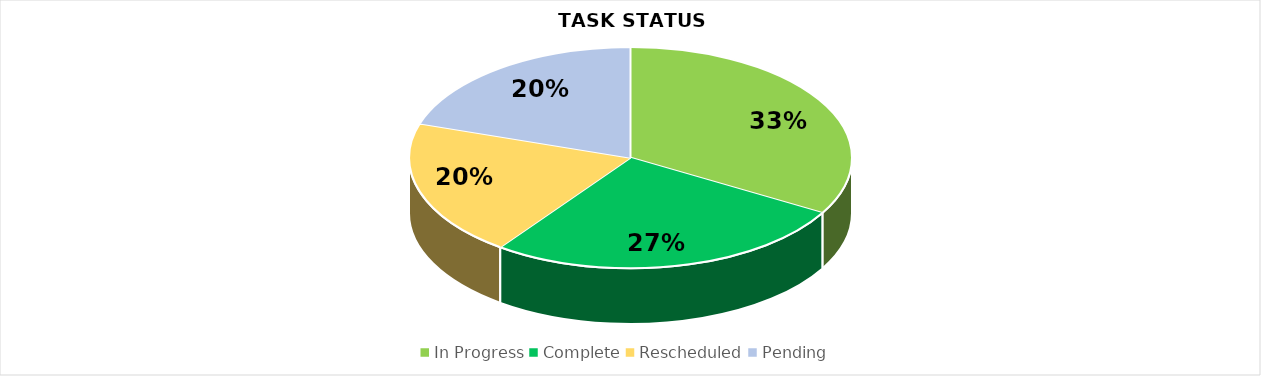
| Category | Series 0 |
|---|---|
| In Progress | 5 |
| Complete | 4 |
| Rescheduled | 3 |
| Pending | 3 |